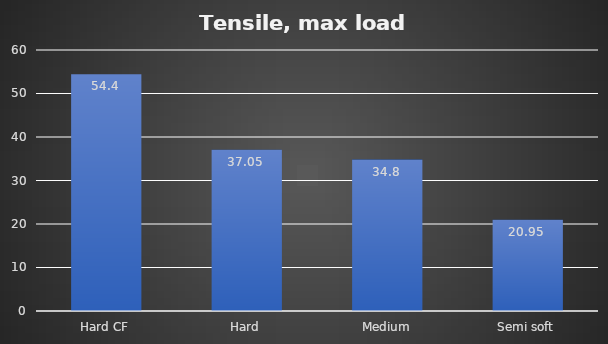
| Category | Average |
|---|---|
| Hard CF | 54.4 |
| Hard | 37.05 |
| Medium | 34.8 |
| Semi soft | 20.95 |